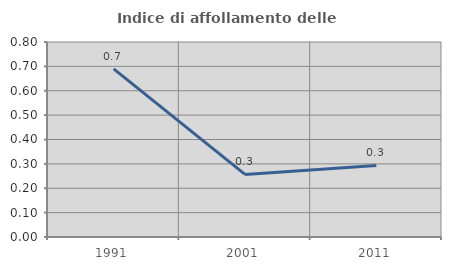
| Category | Indice di affollamento delle abitazioni  |
|---|---|
| 1991.0 | 0.69 |
| 2001.0 | 0.257 |
| 2011.0 | 0.294 |